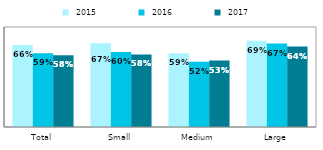
| Category |  2015 |  2016 |  2017 |
|---|---|---|---|
| Total | 0.657 | 0.59 | 0.575 |
| Small | 0.67 | 0.6 | 0.581 |
| Medium | 0.59 | 0.522 | 0.532 |
| Large | 0.691 | 0.668 | 0.644 |